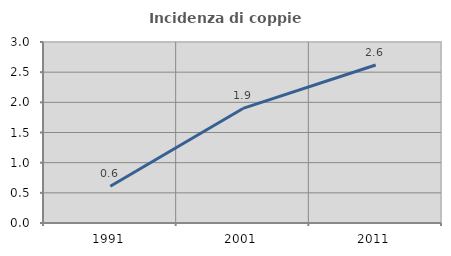
| Category | Incidenza di coppie miste |
|---|---|
| 1991.0 | 0.609 |
| 2001.0 | 1.899 |
| 2011.0 | 2.619 |